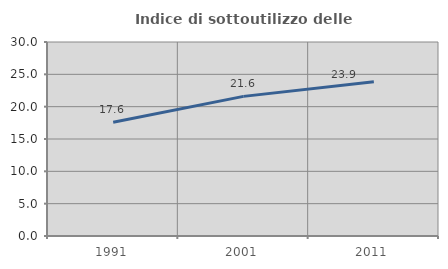
| Category | Indice di sottoutilizzo delle abitazioni  |
|---|---|
| 1991.0 | 17.588 |
| 2001.0 | 21.592 |
| 2011.0 | 23.858 |